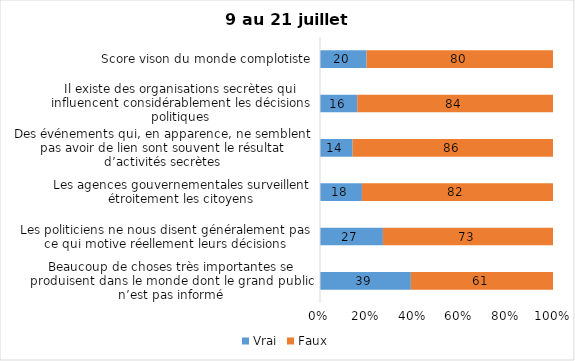
| Category | Vrai | Faux |
|---|---|---|
| Beaucoup de choses très importantes se produisent dans le monde dont le grand public n’est pas informé | 39 | 61 |
| Les politiciens ne nous disent généralement pas ce qui motive réellement leurs décisions | 27 | 73 |
| Les agences gouvernementales surveillent étroitement les citoyens | 18 | 82 |
| Des événements qui, en apparence, ne semblent pas avoir de lien sont souvent le résultat d’activités secrètes | 14 | 86 |
| Il existe des organisations secrètes qui influencent considérablement les décisions politiques | 16 | 84 |
| Score vison du monde complotiste | 20 | 80 |